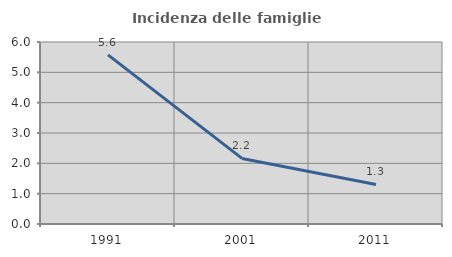
| Category | Incidenza delle famiglie numerose |
|---|---|
| 1991.0 | 5.577 |
| 2001.0 | 2.162 |
| 2011.0 | 1.303 |